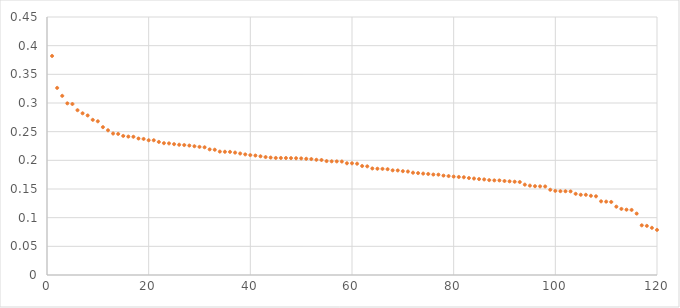
| Category | mean |
|---|---|
| 0 | 0.382 |
| 1 | 0.326 |
| 2 | 0.312 |
| 3 | 0.299 |
| 4 | 0.298 |
| 5 | 0.287 |
| 6 | 0.282 |
| 7 | 0.278 |
| 8 | 0.271 |
| 9 | 0.268 |
| 10 | 0.258 |
| 11 | 0.252 |
| 12 | 0.247 |
| 13 | 0.246 |
| 14 | 0.243 |
| 15 | 0.241 |
| 16 | 0.241 |
| 17 | 0.238 |
| 18 | 0.237 |
| 19 | 0.235 |
| 20 | 0.235 |
| 21 | 0.232 |
| 22 | 0.23 |
| 23 | 0.23 |
| 24 | 0.228 |
| 25 | 0.227 |
| 26 | 0.227 |
| 27 | 0.226 |
| 28 | 0.225 |
| 29 | 0.223 |
| 30 | 0.223 |
| 31 | 0.219 |
| 32 | 0.218 |
| 33 | 0.215 |
| 34 | 0.215 |
| 35 | 0.215 |
| 36 | 0.213 |
| 37 | 0.212 |
| 38 | 0.21 |
| 39 | 0.209 |
| 40 | 0.208 |
| 41 | 0.207 |
| 42 | 0.206 |
| 43 | 0.205 |
| 44 | 0.204 |
| 45 | 0.204 |
| 46 | 0.204 |
| 47 | 0.204 |
| 48 | 0.204 |
| 49 | 0.203 |
| 50 | 0.203 |
| 51 | 0.202 |
| 52 | 0.201 |
| 53 | 0.201 |
| 54 | 0.199 |
| 55 | 0.198 |
| 56 | 0.198 |
| 57 | 0.198 |
| 58 | 0.195 |
| 59 | 0.195 |
| 60 | 0.194 |
| 61 | 0.19 |
| 62 | 0.19 |
| 63 | 0.186 |
| 64 | 0.185 |
| 65 | 0.185 |
| 66 | 0.185 |
| 67 | 0.183 |
| 68 | 0.182 |
| 69 | 0.181 |
| 70 | 0.18 |
| 71 | 0.178 |
| 72 | 0.178 |
| 73 | 0.177 |
| 74 | 0.176 |
| 75 | 0.175 |
| 76 | 0.175 |
| 77 | 0.173 |
| 78 | 0.173 |
| 79 | 0.172 |
| 80 | 0.171 |
| 81 | 0.17 |
| 82 | 0.169 |
| 83 | 0.168 |
| 84 | 0.167 |
| 85 | 0.167 |
| 86 | 0.166 |
| 87 | 0.165 |
| 88 | 0.165 |
| 89 | 0.164 |
| 90 | 0.163 |
| 91 | 0.163 |
| 92 | 0.162 |
| 93 | 0.158 |
| 94 | 0.156 |
| 95 | 0.155 |
| 96 | 0.155 |
| 97 | 0.154 |
| 98 | 0.149 |
| 99 | 0.147 |
| 100 | 0.146 |
| 101 | 0.146 |
| 102 | 0.146 |
| 103 | 0.142 |
| 104 | 0.14 |
| 105 | 0.14 |
| 106 | 0.138 |
| 107 | 0.137 |
| 108 | 0.128 |
| 109 | 0.128 |
| 110 | 0.127 |
| 111 | 0.119 |
| 112 | 0.115 |
| 113 | 0.114 |
| 114 | 0.113 |
| 115 | 0.107 |
| 116 | 0.087 |
| 117 | 0.086 |
| 118 | 0.082 |
| 119 | 0.079 |